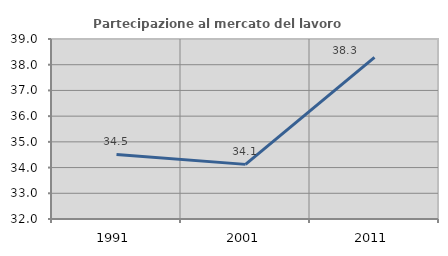
| Category | Partecipazione al mercato del lavoro  femminile |
|---|---|
| 1991.0 | 34.508 |
| 2001.0 | 34.124 |
| 2011.0 | 38.288 |